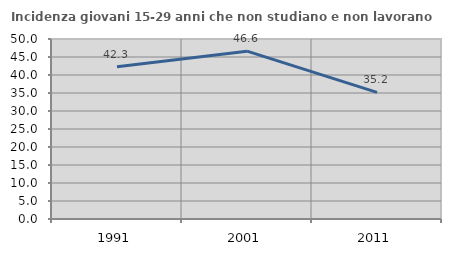
| Category | Incidenza giovani 15-29 anni che non studiano e non lavorano  |
|---|---|
| 1991.0 | 42.295 |
| 2001.0 | 46.626 |
| 2011.0 | 35.19 |